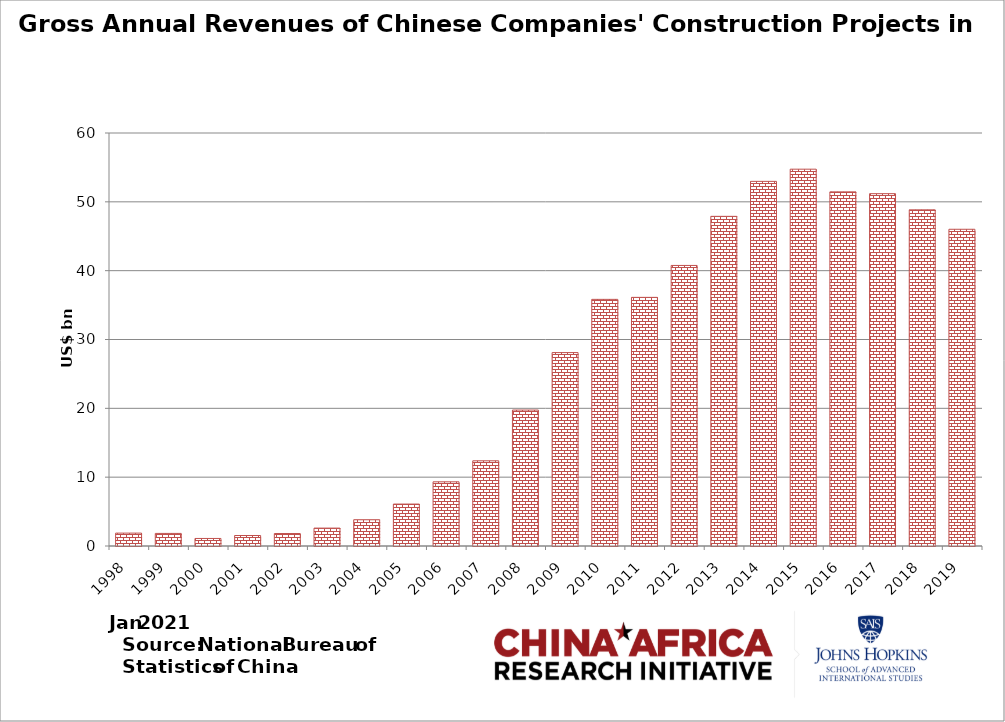
| Category | Series 1 |
|---|---|
| 1998.0 | 1.871 |
| 1999.0 | 1.828 |
| 2000.0 | 1.096 |
| 2001.0 | 1.524 |
| 2002.0 | 1.814 |
| 2003.0 | 2.601 |
| 2004.0 | 3.812 |
| 2005.0 | 6.092 |
| 2006.0 | 9.324 |
| 2007.0 | 12.376 |
| 2008.0 | 19.749 |
| 2009.0 | 28.099 |
| 2010.0 | 35.83 |
| 2011.0 | 36.122 |
| 2012.0 | 40.758 |
| 2013.0 | 47.891 |
| 2014.0 | 52.974 |
| 2015.0 | 54.744 |
| 2016.0 | 51.45 |
| 2017.0 | 51.188 |
| 2018.0 | 48.839 |
| 2019.0 | 46.013 |